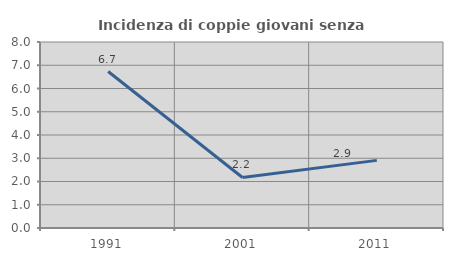
| Category | Incidenza di coppie giovani senza figli |
|---|---|
| 1991.0 | 6.731 |
| 2001.0 | 2.174 |
| 2011.0 | 2.909 |